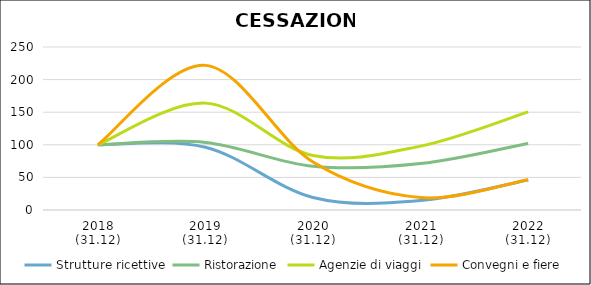
| Category | Strutture ricettive | Ristorazione | Agenzie di viaggi | Convegni e fiere |
|---|---|---|---|---|
| 2018
(31.12) | 100 | 100 | 100 | 100 |
| 2019
(31.12) | 96.368 | 103.624 | 163.918 | 221.818 |
| 2020
(31.12) | 19.237 | 67.052 | 83.505 | 73.636 |
| 2021
(31.12) | 14.406 | 71.207 | 97.938 | 19.091 |
| 2022
(31.12) | 45.983 | 102.073 | 150.515 | 46.364 |